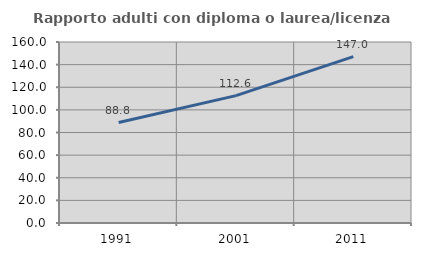
| Category | Rapporto adulti con diploma o laurea/licenza media  |
|---|---|
| 1991.0 | 88.821 |
| 2001.0 | 112.583 |
| 2011.0 | 147.004 |